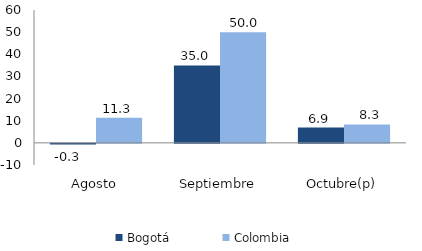
| Category | Bogotá | Colombia |
|---|---|---|
| Agosto | -0.26 | 11.283 |
| Septiembre | 34.974 | 50.006 |
| Octubre(p) | 6.88 | 8.316 |